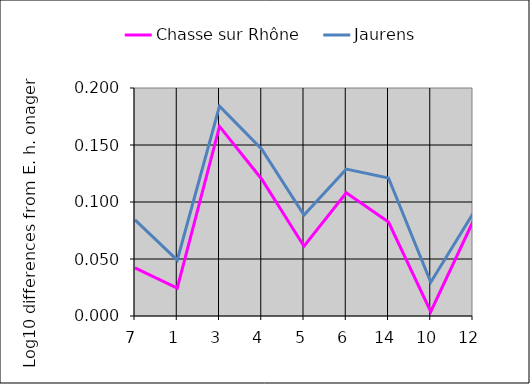
| Category | Chasse sur Rhône | Jaurens  |
|---|---|---|
| 7.0 | 0.042 | 0.084 |
| 1.0 | 0.024 | 0.049 |
| 3.0 | 0.166 | 0.184 |
| 4.0 | 0.12 | 0.146 |
| 5.0 | 0.061 | 0.088 |
| 6.0 | 0.108 | 0.129 |
| 14.0 | 0.082 | 0.121 |
| 10.0 | 0.004 | 0.03 |
| 12.0 | 0.083 | 0.09 |